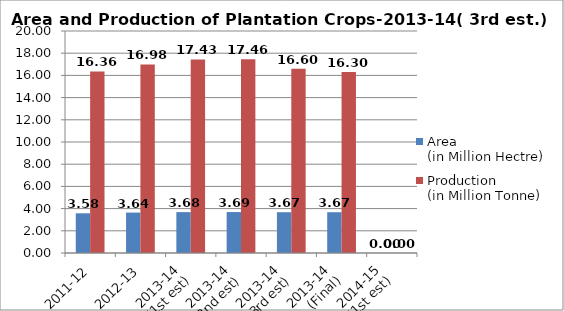
| Category | Area
(in Million Hectre) | Production
(in Million Tonne) |
|---|---|---|
| 2011-12 | 3.577 | 16.359 |
| 2012-13 | 3.641 | 16.985 |
| 2013-14
(1st est) | 3.683 | 17.434 |
| 2013-14
(2nd est) | 3.69 | 17.462 |
| 2013-14
(3rd est) | 3.674 | 16.598 |
| 2013-14
(Final) | 3.675 | 16.301 |
| 2014-15
(1st est) | 0 | 0 |